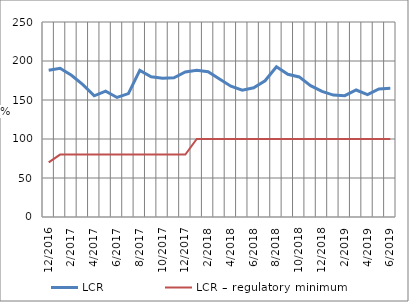
| Category | LCR | LCR – regulatory minimum |
|---|---|---|
| 12/2016 | 188.022 | 70 |
| 1/2017 | 190.625 | 80 |
| 2/2017 | 181.648 | 80 |
| 3/2017 | 169.614 | 80 |
| 4/2017 | 155.35 | 80 |
| 5/2017 | 161.366 | 80 |
| 6/2017 | 153.248 | 80 |
| 7/2017 | 158.157 | 80 |
| 8/2017 | 187.93 | 80 |
| 9/2017 | 179.808 | 80 |
| 10/2017 | 177.926 | 80 |
| 11/2017 | 178.368 | 80 |
| 12/2017 | 185.87 | 80 |
| 1/2018 | 188.112 | 100 |
| 2/2018 | 186.255 | 100 |
| 3/2018 | 176.901 | 100 |
| 4/2018 | 167.696 | 100 |
| 5/2018 | 162.556 | 100 |
| 6/2018 | 165.604 | 100 |
| 7/2018 | 174.63 | 100 |
| 8/2018 | 192.564 | 100 |
| 9/2018 | 182.94 | 100 |
| 10/2018 | 179.584 | 100 |
| 11/2018 | 168.442 | 100 |
| 12/2018 | 161.018 | 100 |
| 1/2019 | 156.26 | 100 |
| 2/2019 | 155.567 | 100 |
| 3/2019 | 162.82 | 100 |
| 4/2019 | 156.989 | 100 |
| 5/2019 | 164.127 | 100 |
| 6/2019 | 165.001 | 100 |